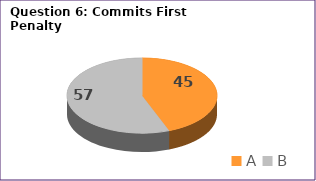
| Category | Series 0 |
|---|---|
| A | 45 |
| B | 57 |